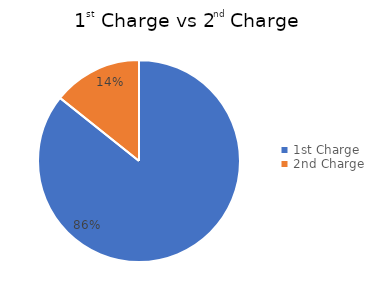
| Category | Series 0 |
|---|---|
| 1st Charge | 0.857 |
| 2nd Charge | 0.143 |